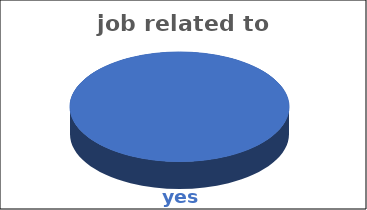
| Category | job related to studies | Series 1 | Series 2 | Series 3 | Series 4 |
|---|---|---|---|---|---|
| yes | 1 |  |  |  |  |